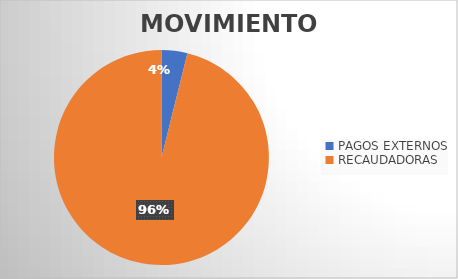
| Category | MOVIMIENTOS |
|---|---|
| PAGOS EXTERNOS | 778 |
| RECAUDADORAS | 19255 |